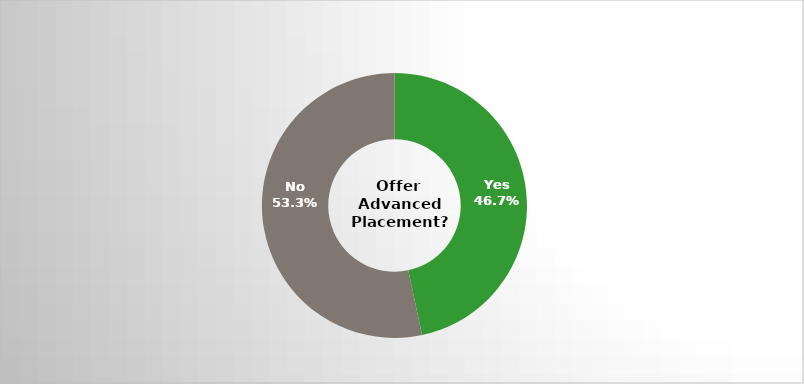
| Category | Series 0 |
|---|---|
| Yes | 0.467 |
| No | 0.533 |